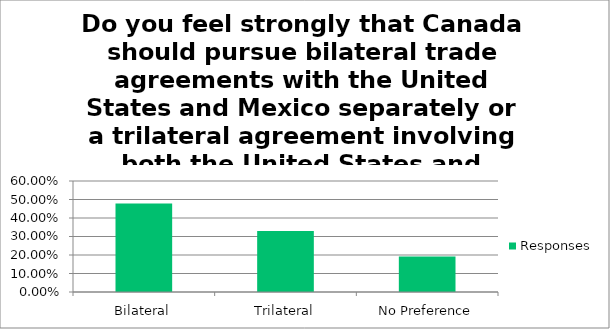
| Category | Responses |
|---|---|
| Bilateral | 0.479 |
| Trilateral | 0.33 |
| No Preference | 0.192 |